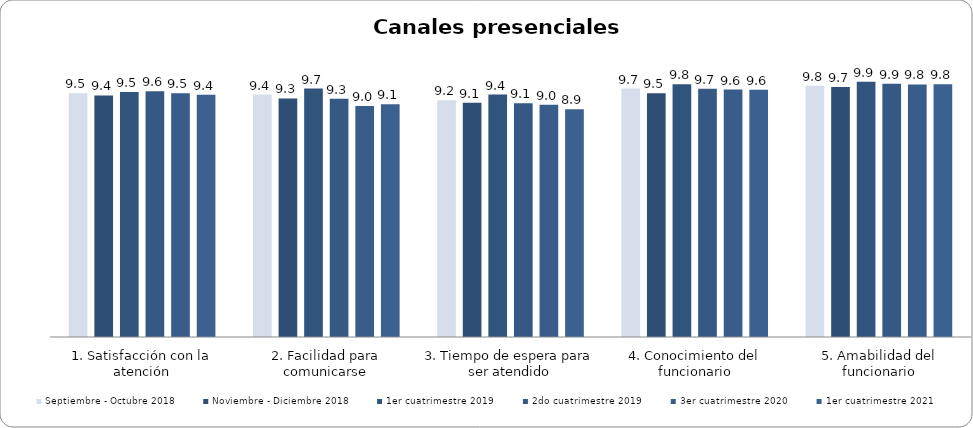
| Category | Septiembre - Octubre 2018 | Noviembre - Diciembre 2018 | 1er cuatrimestre 2019 | 2do cuatrimestre 2019 | 3er cuatrimestre 2020 | 1er cuatrimestre 2021 |
|---|---|---|---|---|---|---|
| 1. Satisfacción con la atención | 9.484 | 9.398 | 9.533 | 9.567 | 9.488 | 9.431 |
| 2. Facilidad para comunicarse | 9.435 | 9.282 | 9.667 | 9.268 | 8.988 | 9.056 |
| 3. Tiempo de espera para ser atendido | 9.215 | 9.117 | 9.433 | 9.093 | 9.035 | 8.861 |
| 4. Conocimiento del funcionario | 9.667 | 9.485 | 9.833 | 9.66 | 9.628 | 9.625 |
| 5. Amabilidad del funcionario | 9.774 | 9.728 | 9.933 | 9.856 | 9.826 | 9.833 |